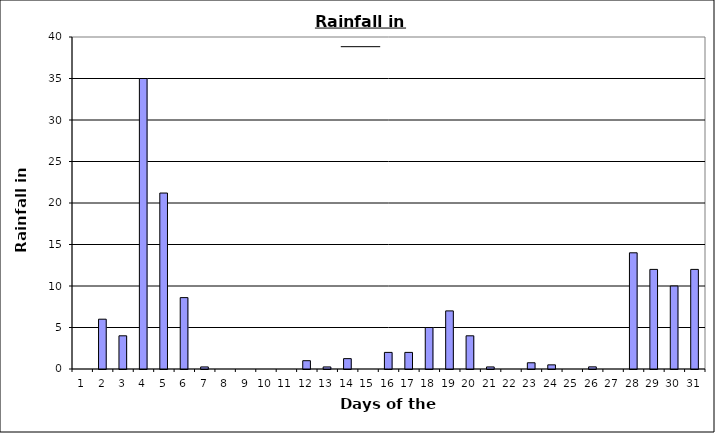
| Category | Series 0 |
|---|---|
| 0 | 0 |
| 1 | 6 |
| 2 | 4 |
| 3 | 35 |
| 4 | 21.2 |
| 5 | 8.6 |
| 6 | 0.25 |
| 7 | 0 |
| 8 | 0 |
| 9 | 0 |
| 10 | 0 |
| 11 | 1 |
| 12 | 0.25 |
| 13 | 1.25 |
| 14 | 0 |
| 15 | 2 |
| 16 | 2 |
| 17 | 5 |
| 18 | 7 |
| 19 | 4 |
| 20 | 0.25 |
| 21 | 0 |
| 22 | 0.75 |
| 23 | 0.5 |
| 24 | 0 |
| 25 | 0.258 |
| 26 | 0 |
| 27 | 14 |
| 28 | 12 |
| 29 | 10 |
| 30 | 12 |